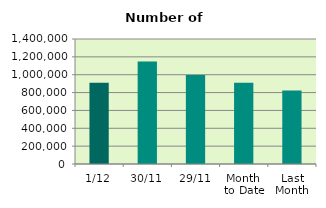
| Category | Series 0 |
|---|---|
| 1/12 | 909848 |
| 30/11 | 1147918 |
| 29/11 | 996942 |
| Month 
to Date | 909848 |
| Last
Month | 823936.455 |